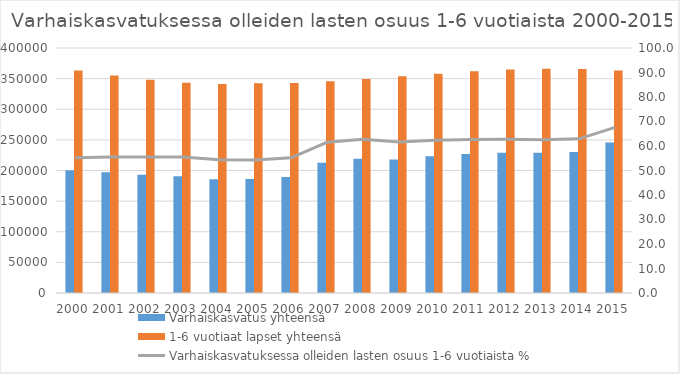
| Category | Varhaiskasvatus yhteensä | 1-6 vuotiaat lapset yhteensä |
|---|---|---|
| 2000 | 200487 | 363160 |
| 2001 | 197136 | 355117 |
| 2002 | 193250 | 348252 |
| 2003 | 190585 | 343449 |
| 2004 | 185669 | 341224 |
| 2005 | 186053 | 342487 |
| 2006 | 189332 | 343033 |
| 2007 | 212745 | 345855 |
| 2008 | 219198 | 349351 |
| 2009 | 218005 | 353880 |
| 2010 | 223088 | 358034 |
| 2011 | 226958 | 361989 |
| 2012 | 228981 | 364915 |
| 2013 | 228981 | 365993 |
| 2014 | 230038 | 365613 |
| 2015 | 245650 | 363349 |